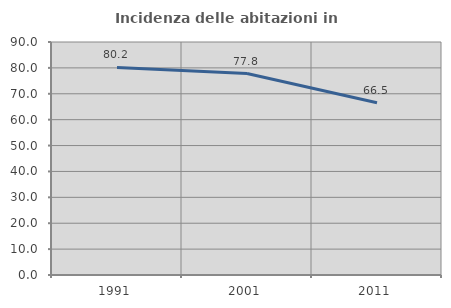
| Category | Incidenza delle abitazioni in proprietà  |
|---|---|
| 1991.0 | 80.151 |
| 2001.0 | 77.822 |
| 2011.0 | 66.525 |